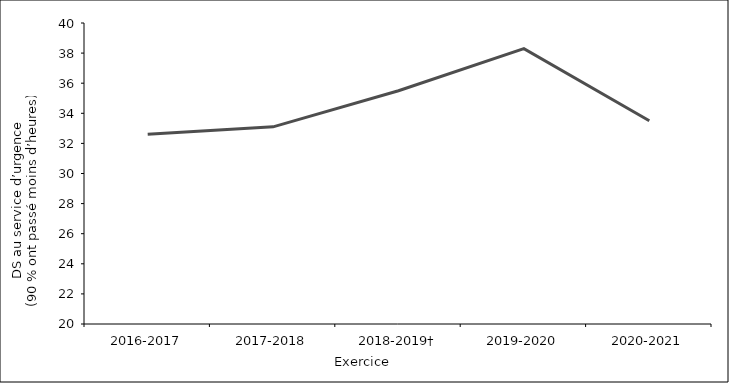
| Category | Series 0 |
|---|---|
| 2016-2017 | 32.6 |
| 2017-2018 | 33.1 |
| 2018-2019† | 35.5 |
| 2019-2020 | 38.3 |
| 2020-2021 | 33.5 |